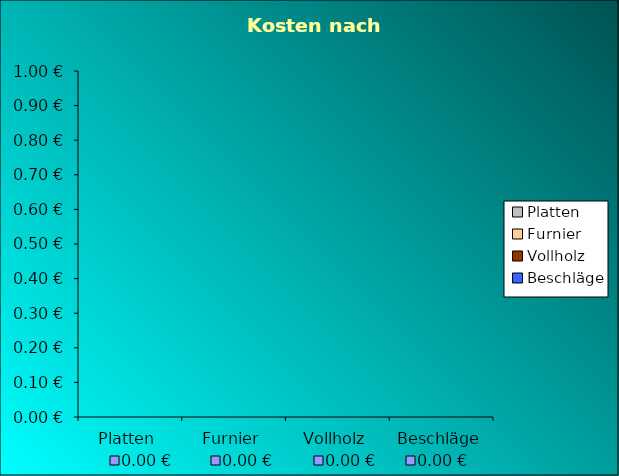
| Category | Series 0 |
|---|---|
| Platten | 0 |
| Furnier | 0 |
| Vollholz | 0 |
| Beschläge | 0 |